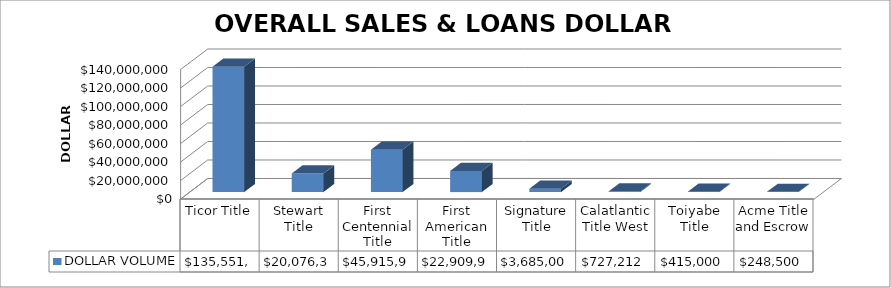
| Category | DOLLAR VOLUME |
|---|---|
| Ticor Title | 135551581 |
| Stewart Title | 20076334.71 |
| First Centennial Title | 45915905 |
| First American Title | 22909960 |
| Signature Title | 3685000 |
| Calatlantic Title West | 727212 |
| Toiyabe Title | 415000 |
| Acme Title and Escrow | 248500 |